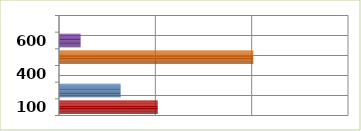
| Category | Series 0 |
|---|---|
| 100.0 | 102460073.987 |
| 200.0 | 63944476 |
| 400.0 | 0 |
| 500.0 | 201685483.631 |
| 600.0 | 22388135.736 |
| 700.0 | 0 |